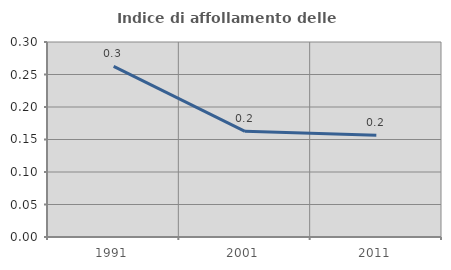
| Category | Indice di affollamento delle abitazioni  |
|---|---|
| 1991.0 | 0.263 |
| 2001.0 | 0.163 |
| 2011.0 | 0.156 |